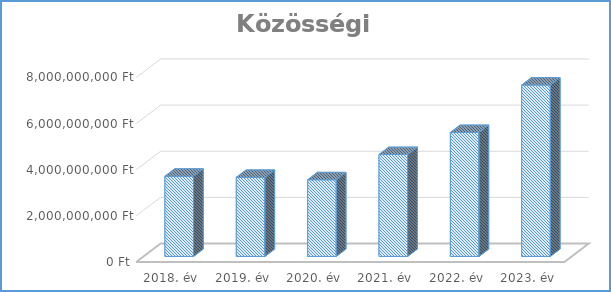
| Category | Közösségi létesítmények |
|---|---|
| 2018. év | 3478294054 |
| 2019. év | 3429801758 |
| 2020. év | 3326137614 |
| 2021. év | 4419613500 |
| 2022. év | 5374305659 |
| 2023. év | 7432316463 |